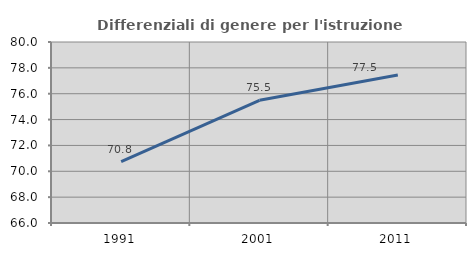
| Category | Differenziali di genere per l'istruzione superiore |
|---|---|
| 1991.0 | 70.753 |
| 2001.0 | 75.494 |
| 2011.0 | 77.454 |